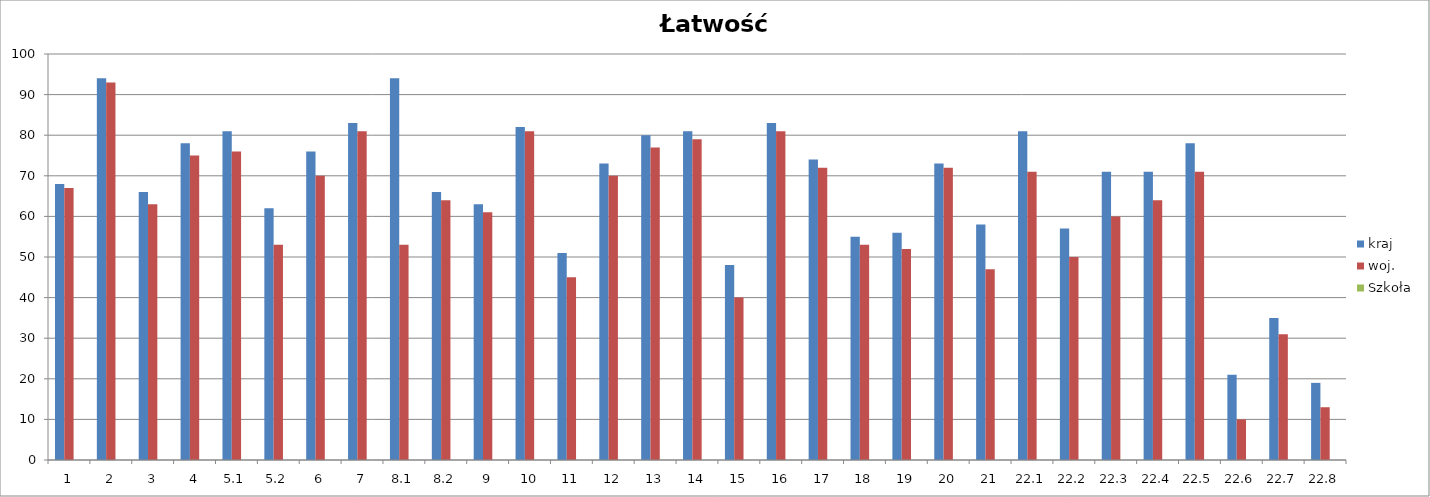
| Category | kraj | woj. | Szkoła |
|---|---|---|---|
| 1 | 68 | 67 | 0 |
| 2 | 94 | 93 | 0 |
| 3 | 66 | 63 | 0 |
| 4 | 78 | 75 | 0 |
| 5.1 | 81 | 76 | 0 |
| 5.2 | 62 | 53 | 0 |
| 6 | 76 | 70 | 0 |
| 7 | 83 | 81 | 0 |
| 8.1 | 94 | 53 | 0 |
| 8.2 | 66 | 64 | 0 |
| 9 | 63 | 61 | 0 |
| 10 | 82 | 81 | 0 |
| 11 | 51 | 45 | 0 |
| 12 | 73 | 70 | 0 |
| 13 | 80 | 77 | 0 |
| 14 | 81 | 79 | 0 |
| 15 | 48 | 40 | 0 |
| 16 | 83 | 81 | 0 |
| 17 | 74 | 72 | 0 |
| 18 | 55 | 53 | 0 |
| 19 | 56 | 52 | 0 |
| 20 | 73 | 72 | 0 |
| 21 | 58 | 47 | 0 |
| 22.1 | 81 | 71 | 0 |
| 22.2 | 57 | 50 | 0 |
| 22.3 | 71 | 60 | 0 |
| 22.4 | 71 | 64 | 0 |
| 22.5 | 78 | 71 | 0 |
| 22.6 | 21 | 10 | 0 |
| 22.7 | 35 | 31 | 0 |
| 22.8 | 19 | 13 | 0 |